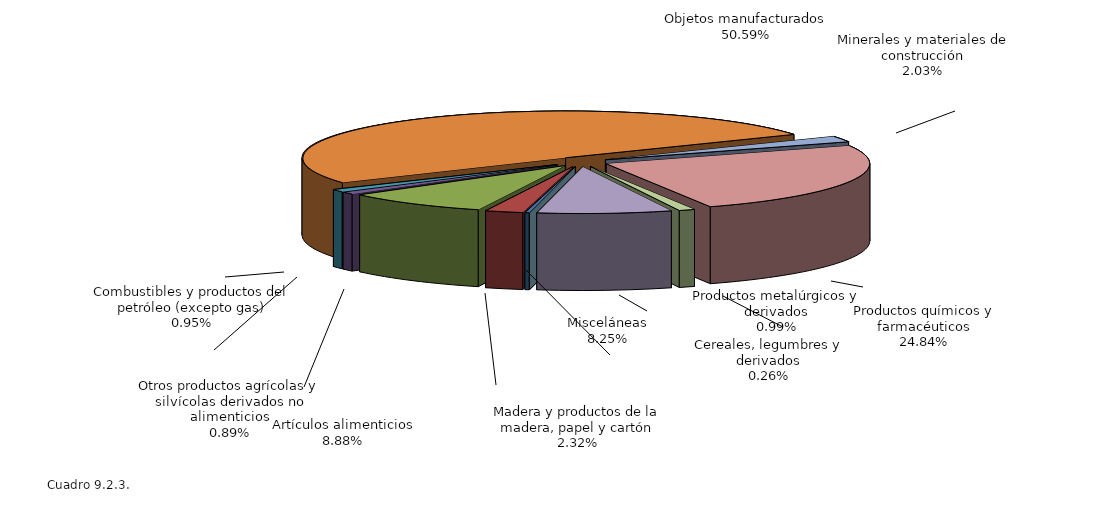
| Category | Series 0 |
|---|---|
| Cereales, legumbres y derivados | 0.263 |
| Madera y productos de la madera, papel y cartón | 2.323 |
| Artículos alimenticios | 8.88 |
| Otros productos agrícolas y silvícolas derivados no alimenticios | 0.891 |
| Combustibles y productos del petróleo (excepto gas) | 0.947 |
| Objetos manufacturados | 50.594 |
| Minerales y materiales de construcción | 2.03 |
| Productos químicos y farmacéuticos | 24.837 |
| Productos metalúrgicos y derivados | 0.985 |
| Misceláneas | 8.25 |